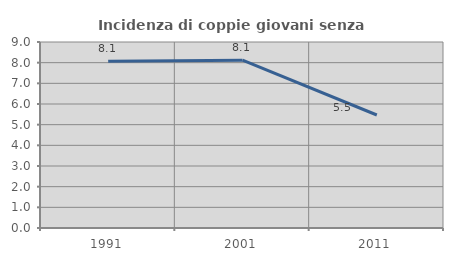
| Category | Incidenza di coppie giovani senza figli |
|---|---|
| 1991.0 | 8.067 |
| 2001.0 | 8.12 |
| 2011.0 | 5.468 |